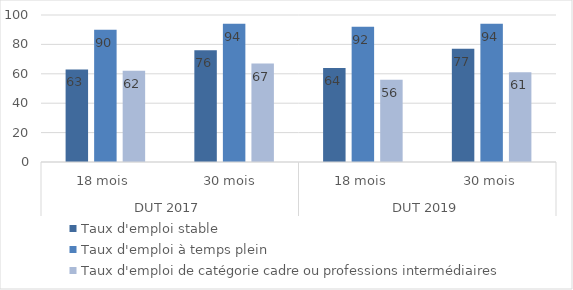
| Category | Taux d'emploi stable | Taux d'emploi à temps plein | Taux d'emploi de catégorie cadre ou professions intermédiaires |
|---|---|---|---|
| 0 | 63 | 90 | 62 |
| 1 | 76 | 94 | 67 |
| 2 | 64 | 92 | 56 |
| 3 | 77 | 94 | 61 |